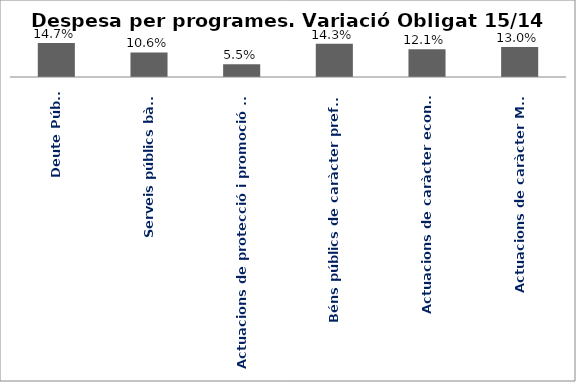
| Category | Series 0 |
|---|---|
| Deute Públic | 0.147 |
| Serveis públics bàsics | 0.106 |
| Actuacions de protecció i promoció social | 0.055 |
| Béns públics de caràcter preferent | 0.143 |
| Actuacions de caràcter econòmic | 0.121 |
| Actuacions de caràcter Marçal | 0.13 |